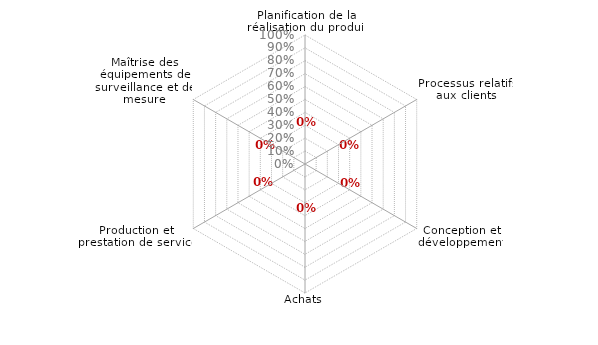
| Category | en attente |
|---|---|
| 0 | 0 |
| 1 | 0 |
| 2 | 0 |
| 3 | 0 |
| 4 | 0 |
| 5 | 0 |